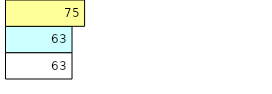
| Category | Total Standouts | Total Recd | Total Tipsters |
|---|---|---|---|
| 0 | 63 | 63 | 75 |